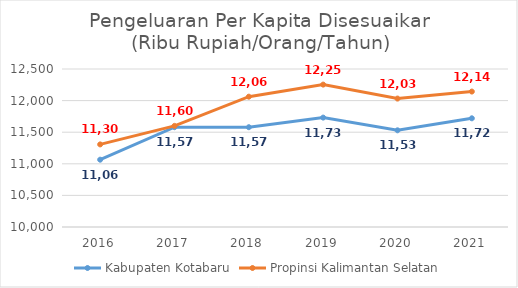
| Category | Kabupaten Kotabaru | Propinsi Kalimantan Selatan |
|---|---|---|
| 2016.0 | 11065 | 11307 |
| 2017.0 | 11579 | 11600 |
| 2018.0 | 11579 | 12062 |
| 2019.0 | 11731 | 12253 |
| 2020.0 | 11530 | 12032 |
| 2021.0 | 11720 | 12143 |